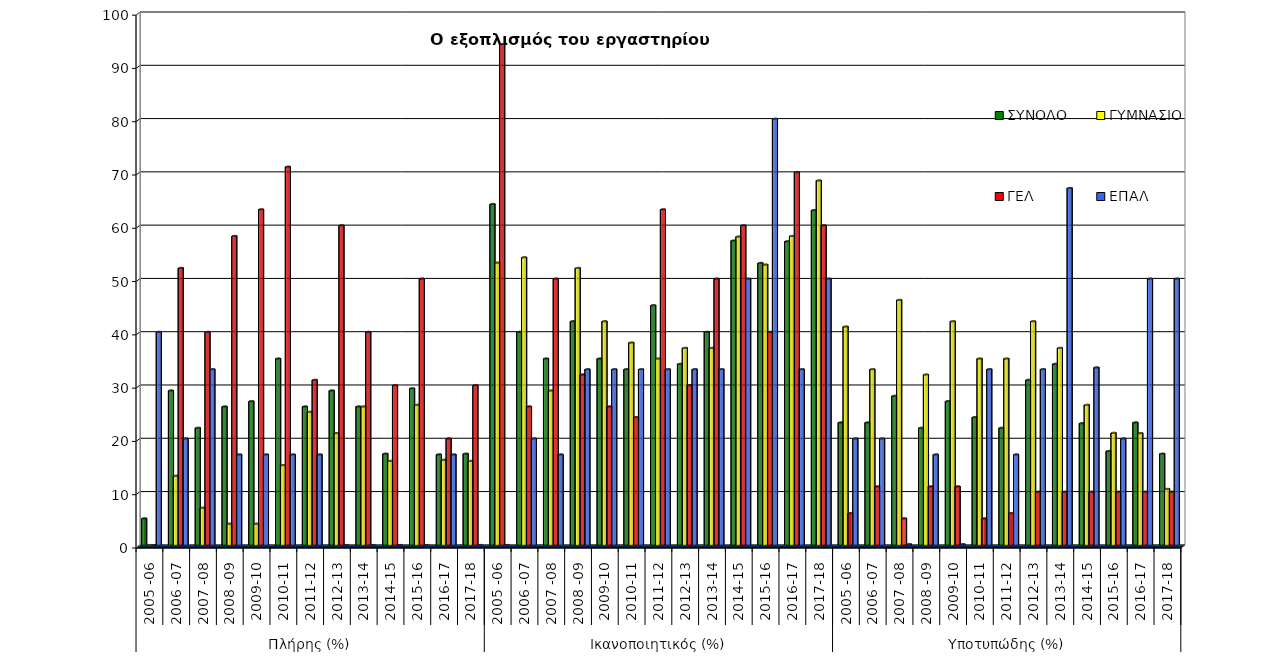
| Category | ΣΥΝΟΛΟ | ΓΥΜΝΑΣΙΟ | ΓΕΛ | ΕΠΑΛ |
|---|---|---|---|---|
| 0 | 5 | 0 | 0 | 40 |
| 1 | 29 | 13 | 52 | 20 |
| 2 | 22 | 7 | 40 | 33 |
| 3 | 26 | 4 | 58 | 17 |
| 4 | 27 | 4 | 63 | 17 |
| 5 | 35 | 15 | 71 | 17 |
| 6 | 26 | 25 | 31 | 17 |
| 7 | 29 | 21 | 60 | 0 |
| 8 | 26 | 26 | 40 | 0 |
| 9 | 17.143 | 15.789 | 30 | 0 |
| 10 | 29.412 | 26.316 | 50 | 0 |
| 11 | 17 | 16 | 20 | 17 |
| 12 | 17.143 | 15.789 | 30 | 0 |
| 13 | 64 | 53 | 94 | 0 |
| 14 | 40 | 54 | 26 | 20 |
| 15 | 35 | 29 | 50 | 17 |
| 16 | 42 | 52 | 32 | 33 |
| 17 | 35 | 42 | 26 | 33 |
| 18 | 33 | 38 | 24 | 33 |
| 19 | 45 | 35 | 63 | 33 |
| 20 | 34 | 37 | 30 | 33 |
| 21 | 40 | 37 | 50 | 33 |
| 22 | 57.143 | 57.895 | 60 | 50 |
| 23 | 52.941 | 52.632 | 40 | 80 |
| 24 | 57 | 58 | 70 | 33 |
| 25 | 62.857 | 68.421 | 60 | 50 |
| 26 | 23 | 41 | 6 | 20 |
| 27 | 23 | 33 | 11 | 20 |
| 28 | 28 | 46 | 5 | 0.17 |
| 29 | 22 | 32 | 11 | 17 |
| 30 | 27 | 42 | 11 | 0.17 |
| 31 | 24 | 35 | 5 | 33 |
| 32 | 22 | 35 | 6 | 17 |
| 33 | 31 | 42 | 10 | 33 |
| 34 | 34 | 37 | 10 | 67 |
| 35 | 22.857 | 26.316 | 10 | 33.333 |
| 36 | 17.647 | 21.053 | 10 | 20 |
| 37 | 23 | 21 | 10 | 50 |
| 38 | 17.143 | 10.526 | 10 | 50 |